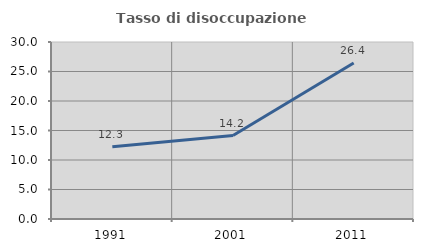
| Category | Tasso di disoccupazione giovanile  |
|---|---|
| 1991.0 | 12.258 |
| 2001.0 | 14.151 |
| 2011.0 | 26.437 |